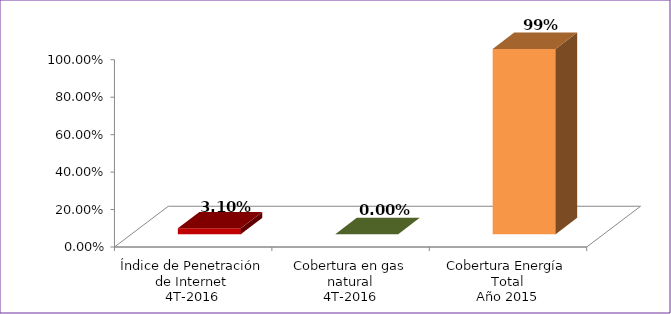
| Category | Series 0 |
|---|---|
| Índice de Penetración de Internet
4T-2016 | 0.031 |
| Cobertura en gas natural
4T-2016 | 0 |
| Cobertura Energía Total
Año 2015 | 0.989 |